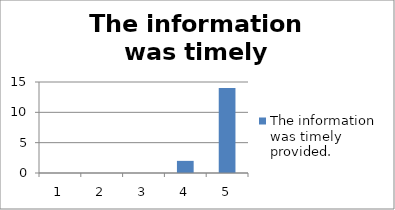
| Category | The information was timely provided. |
|---|---|
| 0 | 0 |
| 1 | 0 |
| 2 | 0 |
| 3 | 2 |
| 4 | 14 |